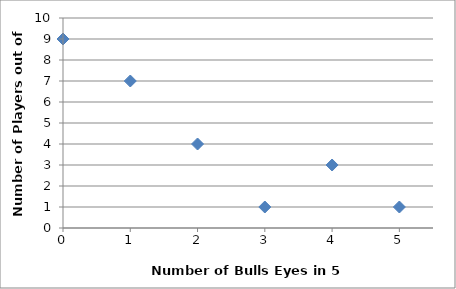
| Category | Number of players |
|---|---|
| 0.0 | 9 |
| 1.0 | 7 |
| 2.0 | 4 |
| 3.0 | 1 |
| 4.0 | 3 |
| 5.0 | 1 |